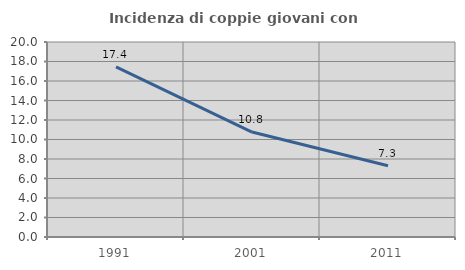
| Category | Incidenza di coppie giovani con figli |
|---|---|
| 1991.0 | 17.448 |
| 2001.0 | 10.766 |
| 2011.0 | 7.311 |